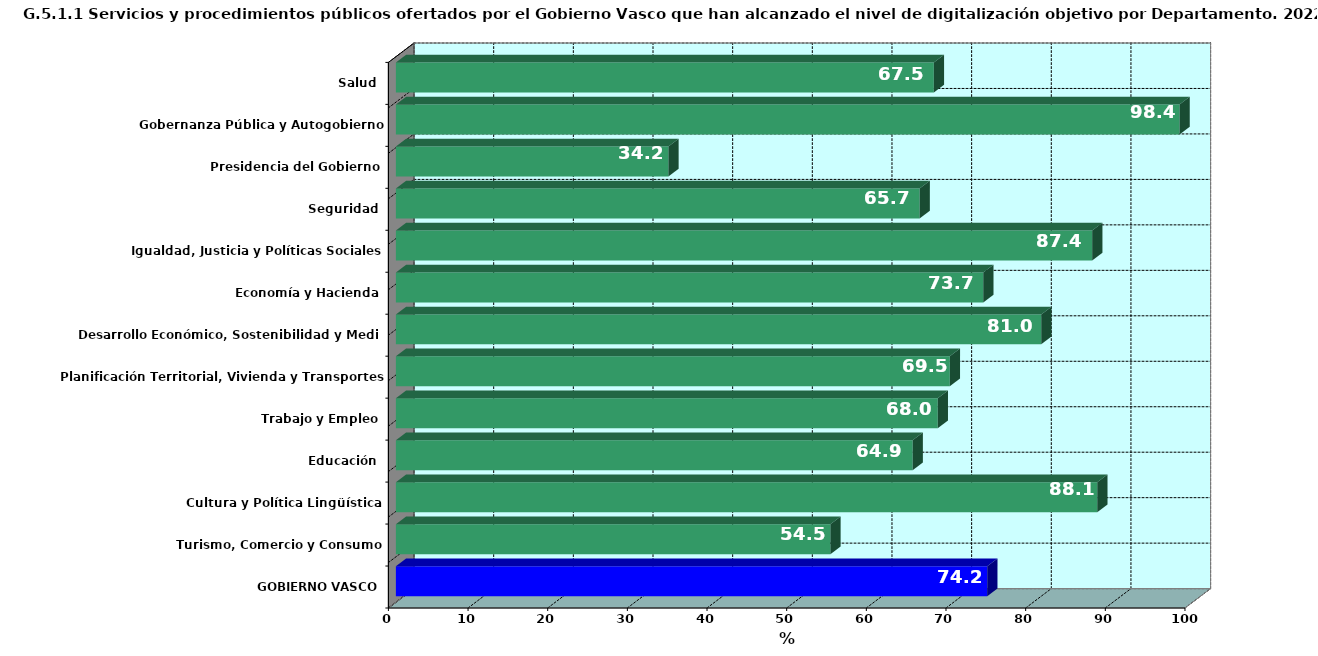
| Category | Series 0 |
|---|---|
| GOBIERNO VASCO | 74.235 |
| Turismo, Comercio y Consumo | 54.545 |
| Cultura y Política Lingüística | 88.05 |
| Educación | 64.871 |
| Trabajo y Empleo | 68.023 |
| Planificación Territorial, Vivienda y Transportes | 69.536 |
| Desarrollo Económico, Sostenibilidad y Medio Ambiente | 81.017 |
| Economía y Hacienda | 73.737 |
| Igualdad, Justicia y Políticas Sociales | 87.413 |
| Seguridad | 65.746 |
| Presidencia del Gobierno | 34.211 |
| Gobernanza Pública y Autogobierno | 98.374 |
| Salud | 67.532 |